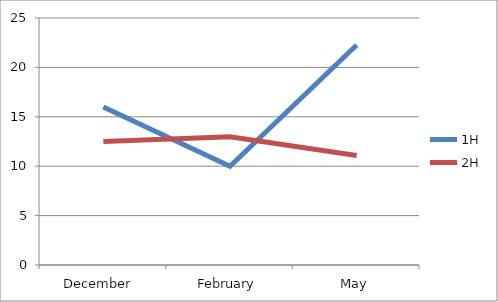
| Category | 1H | 2H |
|---|---|---|
| December  | 15.986 | 12.5 |
| February | 10 | 12.989 |
| May | 22.264 | 11.083 |